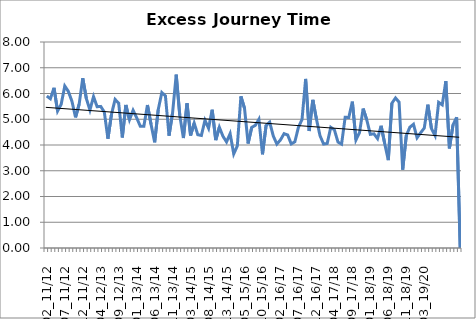
| Category | Series 0 |
|---|---|
| 02_11/12 | 5.901 |
| 03_11/12 | 5.795 |
| 04_11/12 | 6.221 |
| 05_11/12 | 5.319 |
| 06_11/12 | 5.581 |
| 07_11/12 | 6.289 |
| 08_11/12 | 6.08 |
| 09_11/12 | 5.695 |
| 10_11/12 | 5.073 |
| 11_11/12 | 5.588 |
| 12_11/12 | 6.594 |
| 13_11/12 | 5.806 |
| 01_12/13 | 5.356 |
| 02_12/13 | 5.88 |
| 03_12/13 | 5.486 |
| 04_12/13 | 5.498 |
| 05_12/13 | 5.279 |
| 06_12/13 | 4.244 |
| 07_12/13 | 5.196 |
| 08_12/13 | 5.77 |
| 09_12/13 | 5.62 |
| 10_12/13 | 4.293 |
| 11_12/13 | 5.555 |
| 12_12/13 | 4.981 |
| 13_12/13 | 5.347 |
| 01_13/14 | 5.058 |
| 02_13/14 | 4.73 |
| 03_13/14 | 4.726 |
| 04_13/14 | 5.552 |
| 05_13/14 | 4.802 |
| 06_13/14 | 4.104 |
| 07_13/14 | 5.376 |
| 08_13/14 | 6.038 |
| 09_13/14 | 5.907 |
| 10_13/14 | 4.361 |
| 11_13/14 | 5.262 |
| 12_13/14 | 6.731 |
| 13_13/14 | 5.14 |
| 01_14/15 | 4.273 |
| 02_14/15 | 5.62 |
| 03_14/15 | 4.37 |
| 04_14/15 | 4.85 |
| 05_14/15 | 4.4 |
| 06_14/15 | 4.37 |
| 07_14/15 | 4.96 |
| 08_14/15 | 4.65 |
| 09_14/15 | 5.37 |
| 10_14/15 | 4.19 |
| 11_14/15 | 4.69 |
| 12_14/15 | 4.34 |
| 13_14/15 | 4.12 |
| 01_15/16 | 4.441 |
| 02_15/16 | 3.653 |
| 03_15/16 | 3.963 |
| 04_15/16 | 5.89 |
| 05_15/16 | 5.427 |
| 06_15/16 | 4.058 |
| 07_15/16 | 4.683 |
| 08_15/16 | 4.763 |
| 09_15/16 | 4.998 |
| 10_15/16 | 3.638 |
| 11_15/16 | 4.757 |
| 12_15/16 | 4.886 |
| 13_15/16 | 4.352 |
| 01_16/17 | 4.036 |
| 02_16/17 | 4.197 |
| 03_16/17 | 4.44 |
| 04_16/17 | 4.391 |
| 05_16/17 | 4.043 |
| 06_16/17 | 4.126 |
| 07_16/17 | 4.687 |
| 08_16/17 | 4.991 |
| 09_16/17 | 6.564 |
| 10_16/17 | 4.543 |
| 11_16/17 | 5.754 |
| 12_16/17 | 5.011 |
| 13_16/17 | 4.362 |
| 01_17/18 | 4.037 |
| 02_17/18 | 4.059 |
| 03_17/18 | 4.687 |
| 04_17/18 | 4.59 |
| 05_17/18 | 4.114 |
| 06_17/18 | 4.034 |
| 07_17/18 | 5.078 |
| 08_17/18 | 5.068 |
| 09_17/18 | 5.683 |
| 10_17/18 | 4.199 |
| 11_17/18 | 4.487 |
| 12_17/18 | 5.414 |
| 13_17/18 | 4.978 |
| 01_18/19 | 4.413 |
| 02_18/19 | 4.433 |
| 03_18/19 | 4.247 |
| 04_18/19 | 4.746 |
| 05_18/19 | 4.055 |
| 06_18/19 | 3.414 |
| 07_18/19 | 5.625 |
| 08_18/19 | 5.828 |
| 09_18/19 | 5.663 |
| 10_18/19 | 3.043 |
| 11_18/19 | 4.365 |
| 12_18/19 | 4.692 |
| 13_18/19 | 4.805 |
| 01_19/20 | 4.281 |
| 02_19/20 | 4.476 |
| 03_19/20 | 4.657 |
| 04_19/20 | 5.566 |